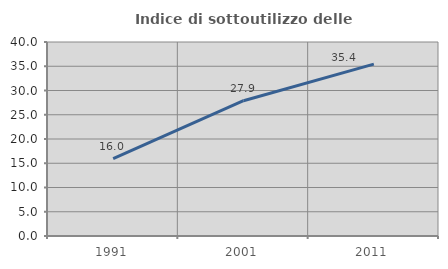
| Category | Indice di sottoutilizzo delle abitazioni  |
|---|---|
| 1991.0 | 15.957 |
| 2001.0 | 27.895 |
| 2011.0 | 35.431 |